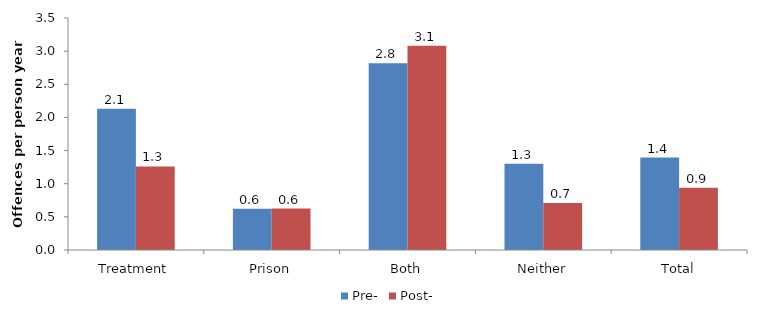
| Category | Pre- | Post- |
|---|---|---|
| Treatment | 2.133 | 1.26 |
| Prison | 0.621 | 0.624 |
| Both | 2.818 | 3.08 |
| Neither | 1.302 | 0.709 |
| Total | 1.395 | 0.937 |